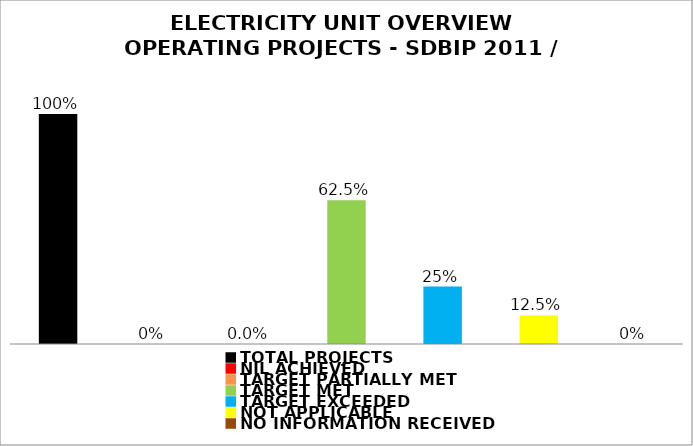
| Category | Series 0 |
|---|---|
| TOTAL PROJECTS | 1 |
| NIL ACHIEVED | 0 |
| TARGET PARTIALLY MET | 0 |
| TARGET MET | 0.625 |
| TARGET EXCEEDED | 0.25 |
| NOT APPLICABLE | 0.125 |
| NO INFORMATION RECEIVED | 0 |